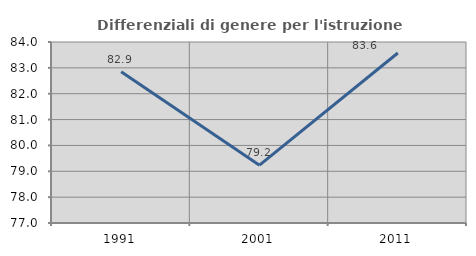
| Category | Differenziali di genere per l'istruzione superiore |
|---|---|
| 1991.0 | 82.85 |
| 2001.0 | 79.235 |
| 2011.0 | 83.575 |